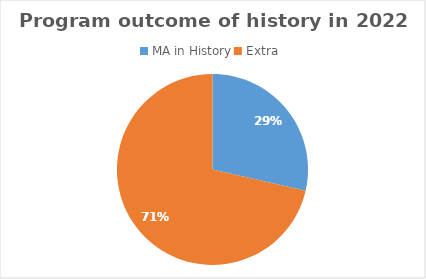
| Category | Series 0 |
|---|---|
| MA in History | 24 |
| Extra  | 60 |